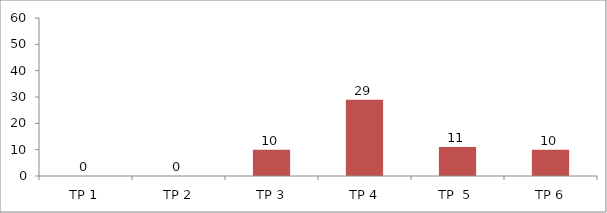
| Category | BIL. MURID |
|---|---|
| TP 1 | 0 |
| TP 2 | 0 |
|  TP 3 | 10 |
| TP 4 | 29 |
| TP  5 | 11 |
| TP 6 | 10 |